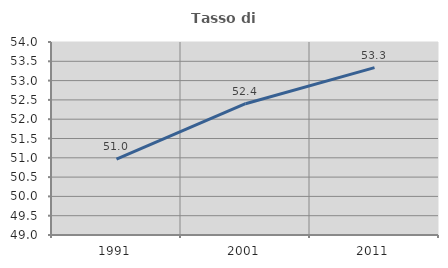
| Category | Tasso di occupazione   |
|---|---|
| 1991.0 | 50.965 |
| 2001.0 | 52.4 |
| 2011.0 | 53.337 |